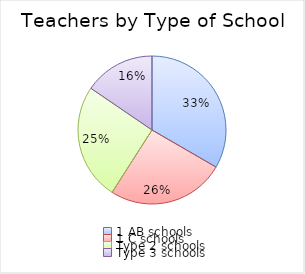
| Category | Series 0 |
|---|---|
| 1 AB schools | 80386 |
| 1 C schools | 61961 |
| Type 2 schools | 61375 |
| Type 3 schools | 37296 |